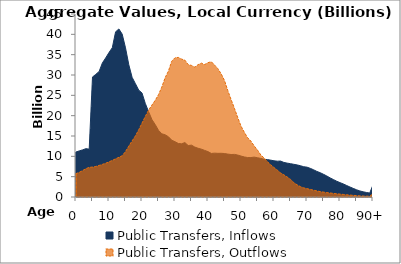
| Category | Public Transfers, Inflows | Public Transfers, Outflows |
|---|---|---|
| 0 | 11066.129 | 5738.988 |
|  | 11341.479 | 6076.832 |
| 2 | 11584.736 | 6487.019 |
| 3 | 11884.506 | 6966.953 |
| 4 | 11768.638 | 7284.157 |
| 5 | 29514.183 | 7366.225 |
| 6 | 30154.705 | 7511.051 |
| 7 | 30856.109 | 7764.331 |
| 8 | 32966.283 | 8016.113 |
| 9 | 34201.995 | 8305.863 |
| 10 | 35525.299 | 8641.439 |
| 11 | 36707.394 | 8999.56 |
| 12 | 40615.609 | 9385.411 |
| 13 | 41320.585 | 9761.011 |
| 14 | 40053.554 | 10148.915 |
| 15 | 36674.6 | 11166.965 |
| 16 | 32523.627 | 12515.045 |
| 17 | 29426.707 | 13788.169 |
| 18 | 27879.654 | 15005.005 |
| 19 | 26288.727 | 16526.64 |
| 20 | 25570.901 | 18168.33 |
| 21 | 23009.156 | 19796.86 |
| 22 | 20979.093 | 21359.988 |
| 23 | 19051.074 | 22594.121 |
| 24 | 17826.142 | 23762.694 |
| 25 | 16393.946 | 25162.095 |
| 26 | 15543.958 | 27019.288 |
| 27 | 15302.098 | 29316.622 |
| 28 | 14824.924 | 30936.968 |
| 29 | 13973.304 | 33378.781 |
| 30 | 13594.959 | 34238.603 |
| 31 | 13162.367 | 34327.033 |
| 32 | 13091.325 | 33905.064 |
| 33 | 13383.83 | 33647.246 |
| 34 | 12646.334 | 32556.861 |
| 35 | 12754.625 | 32352.982 |
| 36 | 12279.022 | 31931.9 |
| 37 | 11985.961 | 32546.662 |
| 38 | 11763.599 | 32908.732 |
| 39 | 11454.703 | 32569.344 |
| 40 | 11160.193 | 33037.255 |
| 41 | 10714.756 | 33261.924 |
| 42 | 10785.95 | 32439.533 |
| 43 | 10738.215 | 31546.74 |
| 44 | 10749.964 | 30266.91 |
| 45 | 10691.241 | 28642.952 |
| 46 | 10554.458 | 26178.623 |
| 47 | 10443.424 | 23951.938 |
| 48 | 10478.534 | 21826.673 |
| 49 | 10316.814 | 19578.01 |
| 50 | 10066.495 | 17438.953 |
| 51 | 9853.483 | 15926.032 |
| 52 | 9708.591 | 14576.34 |
| 53 | 9699.024 | 13745.322 |
| 54 | 9811.783 | 12554.472 |
| 55 | 9652.955 | 11530.863 |
| 56 | 9488.085 | 10343.351 |
| 57 | 9272.223 | 9595.909 |
| 58 | 9199.038 | 8666.187 |
| 59 | 9064.458 | 7927.045 |
| 60 | 8900.597 | 7235.398 |
| 61 | 8807.402 | 6611.891 |
| 62 | 8833.625 | 5913.158 |
| 63 | 8496.142 | 5438.691 |
| 64 | 8330.702 | 4919.04 |
| 65 | 8193.653 | 4327.696 |
| 66 | 8041.123 | 3539.64 |
| 67 | 7884.899 | 2991.511 |
| 68 | 7694.844 | 2550.794 |
| 69 | 7445.421 | 2247.655 |
| 70 | 7336.577 | 2056.248 |
| 71 | 7043.154 | 1871.62 |
| 72 | 6689.615 | 1674.896 |
| 73 | 6287.665 | 1491.859 |
| 74 | 5978.641 | 1331.044 |
| 75 | 5582.253 | 1205.514 |
| 76 | 5170.406 | 1081.852 |
| 77 | 4699.106 | 986.163 |
| 78 | 4295.145 | 888.247 |
| 79 | 3882.529 | 793.168 |
| 80 | 3531.986 | 708.698 |
| 81 | 3211.502 | 631.939 |
| 82 | 2833.362 | 545.302 |
| 83 | 2465.146 | 472.256 |
| 84 | 2118.283 | 404.308 |
| 85 | 1780.301 | 339.842 |
| 86 | 1498.341 | 280.675 |
| 87 | 1283.076 | 238.602 |
| 88 | 1116.397 | 208.273 |
| 89 | 966.018 | 183.01 |
| 90+ | 2957.631 | 776.444 |